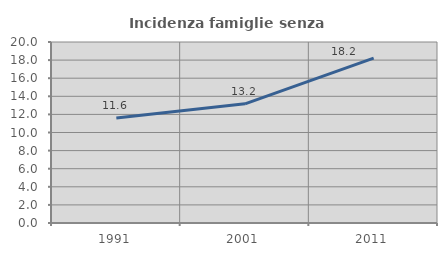
| Category | Incidenza famiglie senza nuclei |
|---|---|
| 1991.0 | 11.612 |
| 2001.0 | 13.165 |
| 2011.0 | 18.213 |